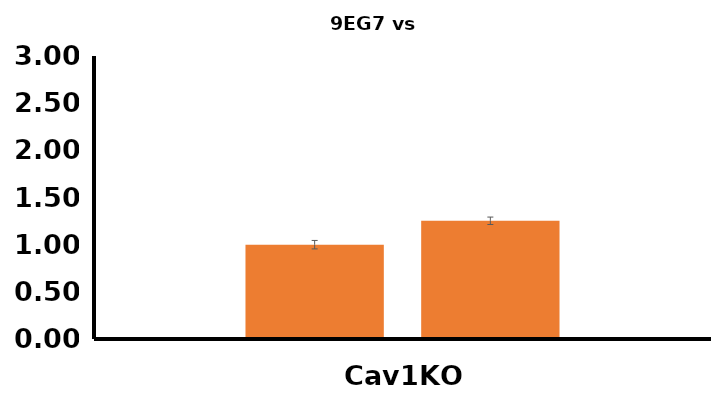
| Category | Control | shRNATLn2+siRNATln1 |
|---|---|---|
| Cav1KO  | 1 | 1.253 |